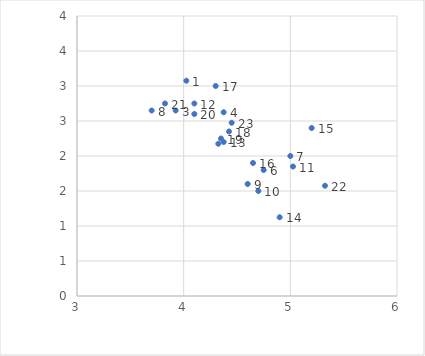
| Category | Mean Nat Res Risk |
|---|---|
| 4.025 | 3.075 |
| 2.9749999999999996 | 3.275 |
| 3.925 | 2.65 |
| 4.375 | 2.625 |
| 4.325 | 2.175 |
| 4.75 | 1.8 |
| 5.0 | 2 |
| 3.6999999999999997 | 2.65 |
| 4.6 | 1.6 |
| 4.7 | 1.5 |
| 5.025 | 1.85 |
| 4.1 | 2.75 |
| 4.375 | 2.2 |
| 4.9 | 1.125 |
| 5.2 | 2.4 |
| 4.65 | 1.9 |
| 4.3 | 3 |
| 4.425 | 2.35 |
| 4.35 | 2.25 |
| 4.1 | 2.6 |
| 3.825 | 2.75 |
| 5.325 | 1.575 |
| 4.45 | 2.475 |